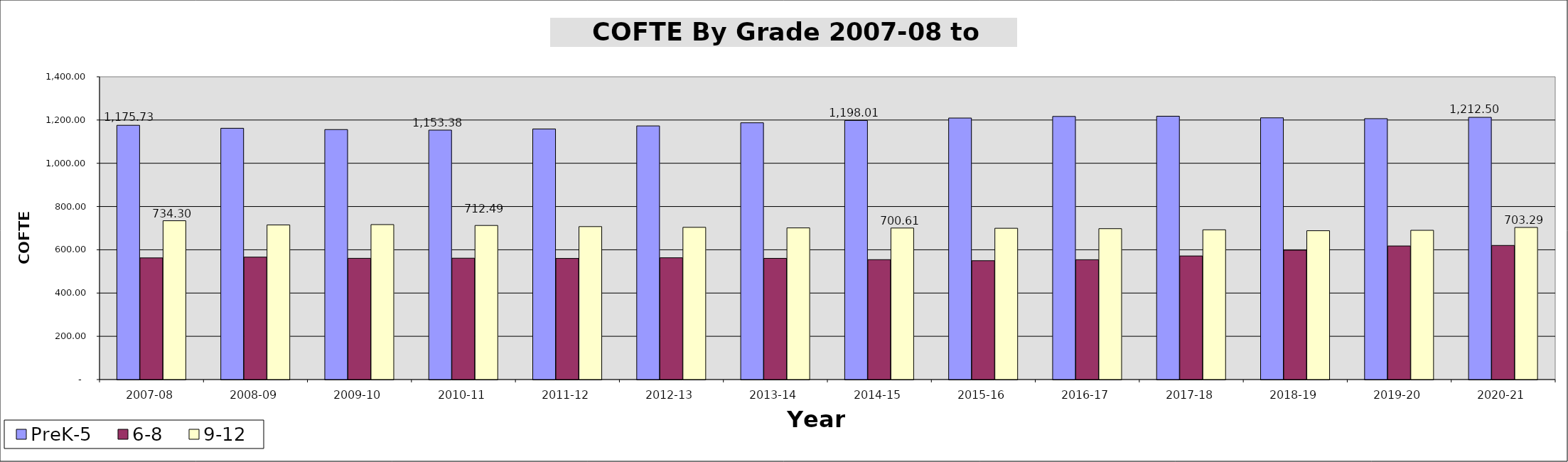
| Category | PreK-5 | 6-8 | 9-12 |
|---|---|---|---|
| 2007-08 | 1175733.92 | 562511 | 734300.16 |
| 2008-09 | 1161919.54 | 566064.98 | 714999.98 |
| 2009-10 | 1155893.43 | 560636.3 | 716499.19 |
| 2010-11 | 1153376.26 | 561165.69 | 712493.39 |
| 2011-12 | 1158665.02 | 559979.28 | 707213.17 |
| 2012-13 | 1172797.57 | 563095.34 | 703861.66 |
| 2013-14 | 1187304.36 | 560386.72 | 701216.77 |
| 2014-15 | 1198005.49 | 554405.12 | 700609.18 |
| 2015-16 | 1209187.46 | 549556.7 | 699529.95 |
| 2016-17 | 1216570.58 | 554157.56 | 697638.15 |
| 2017-18 | 1217600.6 | 571466.59 | 692362.73 |
| 2018-19 | 1210164.69 | 598307.26 | 688180.44 |
| 2019-20 | 1206315.07 | 617682.67 | 690040.11 |
| 2020-21 | 1212503.01 | 620107.08 | 703286.55 |